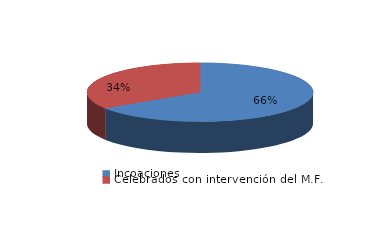
| Category | Series 0 |
|---|---|
| Incoaciones | 2782 |
| Celebrados con intervención del M.F. | 1452 |